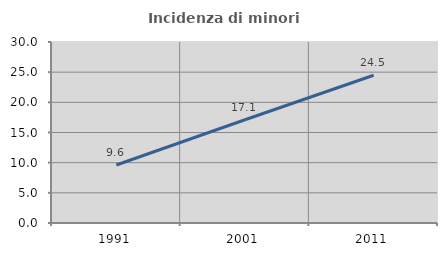
| Category | Incidenza di minori stranieri |
|---|---|
| 1991.0 | 9.615 |
| 2001.0 | 17.117 |
| 2011.0 | 24.492 |